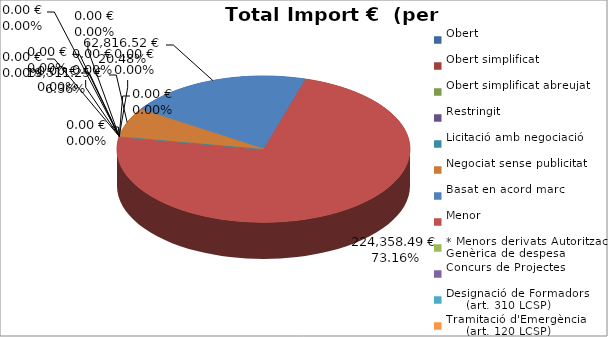
| Category | Total preu
(amb IVA) |
|---|---|
| Obert | 0 |
| Obert simplificat | 0 |
| Obert simplificat abreujat | 0 |
| Restringit | 0 |
| Licitació amb negociació | 0 |
| Negociat sense publicitat | 19511.25 |
| Basat en acord marc | 62816.52 |
| Menor | 224358.49 |
| * Menors derivats Autorització Genèrica de despesa | 0 |
| Concurs de Projectes | 0 |
| Designació de Formadors
     (art. 310 LCSP) | 0 |
| Tramitació d'Emergència
     (art. 120 LCSP) | 0 |